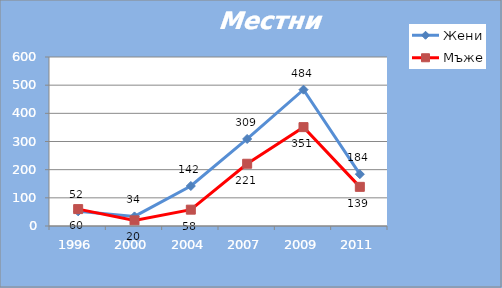
| Category | Жени | Мъже |
|---|---|---|
| 1996.0 | 52 | 60 |
| 2000.0 | 34 | 20 |
| 2004.0 | 142 | 58 |
| 2007.0 | 309 | 221 |
| 2009.0 | 484 | 351 |
| 2011.0 | 184 | 139 |